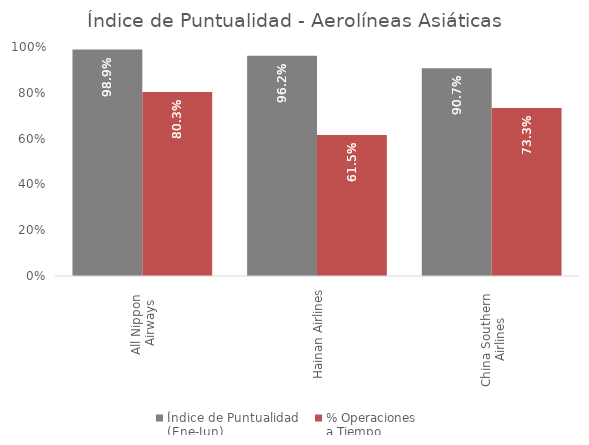
| Category | Índice de Puntualidad
(Ene-Jun) | % Operaciones 
a Tiempo |
|---|---|---|
| All Nippon 
Airways | 0.989 | 0.803 |
| Hainan Airlines | 0.962 | 0.615 |
| China Southern 
Airlines | 0.907 | 0.733 |